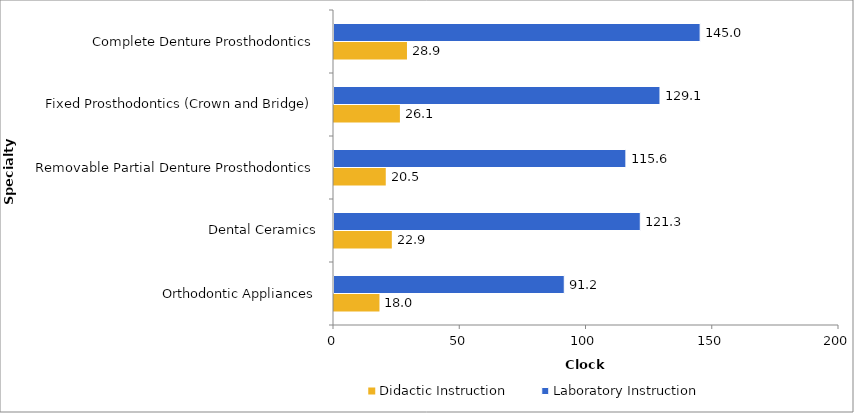
| Category | Didactic Instruction | Laboratory Instruction |
|---|---|---|
| Orthodontic Appliances | 18 | 91.2 |
| Dental Ceramics | 22.9 | 121.3 |
| Removable Partial Denture Prosthodontics | 20.5 | 115.6 |
| Fixed Prosthodontics (Crown and Bridge) | 26.1 | 129.1 |
| Complete Denture Prosthodontics | 28.9 | 145 |